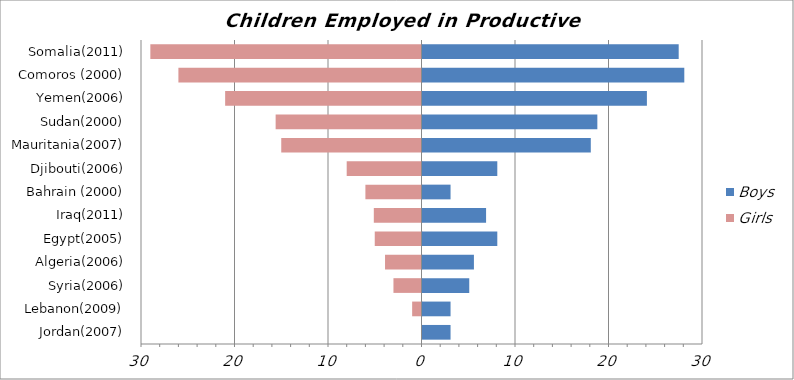
| Category | Girls | Boys |
|---|---|---|
| Jordan(2007) | 0 | 3 |
| Lebanon(2009) | -1 | 3 |
| Syria(2006) | -3 | 5 |
| Algeria(2006) | -3.9 | 5.5 |
| Egypt(2005) | -5 | 8 |
| Iraq(2011) | -5.1 | 6.8 |
| Bahrain (2000) | -6 | 3 |
| Djibouti(2006) | -8 | 8 |
| Mauritania(2007) | -15 | 18 |
| Sudan(2000) | -15.6 | 18.7 |
| Yemen(2006) | -21 | 24 |
| Comoros (2000) | -26 | 28 |
| Somalia(2011) | -29 | 27.4 |